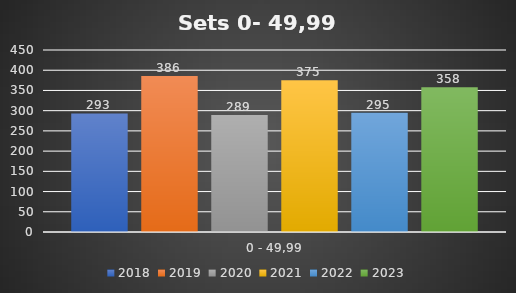
| Category | 2018 | 2019 | 2020 | 2021 | 2022 | 2023 |
|---|---|---|---|---|---|---|
| 0 - 49,99 | 293 | 386 | 289 | 375 | 295 | 358 |